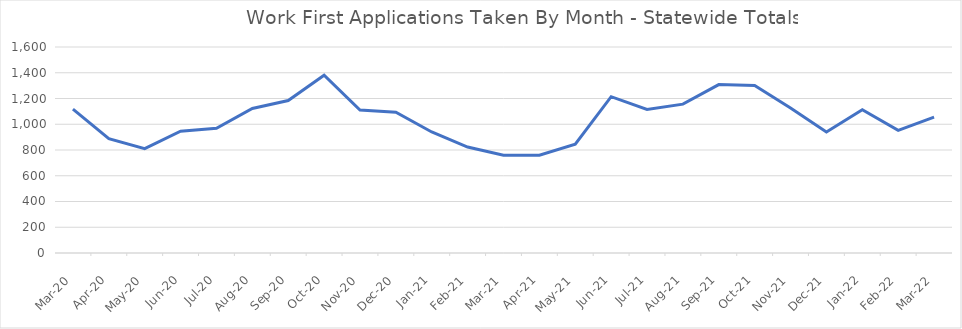
| Category | Series 0 |
|---|---|
| 2022-03-01 | 1056 |
| 2022-02-01 | 953 |
| 2022-01-01 | 1113 |
| 2021-12-02 | 940 |
| 2021-11-01 | 1127 |
| 2021-10-01 | 1301 |
| 2021-09-01 | 1308 |
| 2021-08-01 | 1156 |
| 2021-07-01 | 1115 |
| 2021-06-01 | 1214 |
| 2021-05-01 | 845 |
| 2021-04-01 | 759 |
| 2021-03-01 | 760 |
| 2021-02-01 | 823 |
| 2021-01-01 | 940 |
| 2020-12-01 | 1093 |
| 2020-11-01 | 1110 |
| 2020-10-01 | 1381 |
| 2020-09-01 | 1184 |
| 2020-08-01 | 1123 |
| 2020-07-01 | 969 |
| 2020-06-01 | 946 |
| 2020-05-01 | 810 |
| 2020-04-01 | 888 |
| 2020-03-01 | 1117 |